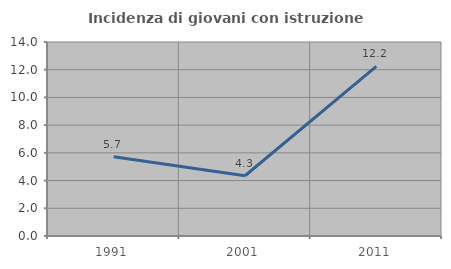
| Category | Incidenza di giovani con istruzione universitaria |
|---|---|
| 1991.0 | 5.714 |
| 2001.0 | 4.348 |
| 2011.0 | 12.245 |